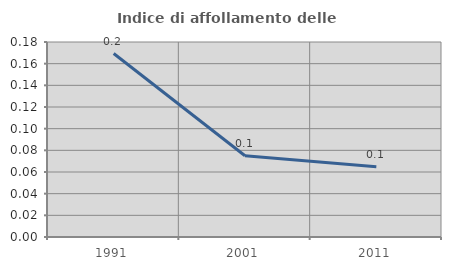
| Category | Indice di affollamento delle abitazioni  |
|---|---|
| 1991.0 | 0.169 |
| 2001.0 | 0.075 |
| 2011.0 | 0.065 |